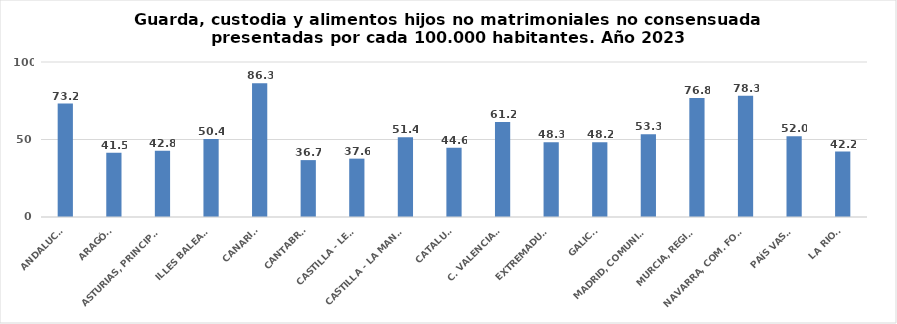
| Category | Series 0 |
|---|---|
| ANDALUCÍA | 73.161 |
| ARAGÓN | 41.502 |
| ASTURIAS, PRINCIPADO | 42.817 |
| ILLES BALEARS | 50.384 |
| CANARIAS | 86.267 |
| CANTABRIA | 36.702 |
| CASTILLA - LEÓN | 37.649 |
| CASTILLA - LA MANCHA | 51.427 |
| CATALUÑA | 44.6 |
| C. VALENCIANA | 61.227 |
| EXTREMADURA | 48.278 |
| GALICIA | 48.227 |
| MADRID, COMUNIDAD | 53.322 |
| MURCIA, REGIÓN | 76.835 |
| NAVARRA, COM. FORAL | 78.251 |
| PAÍS VASCO | 52.029 |
| LA RIOJA | 42.202 |